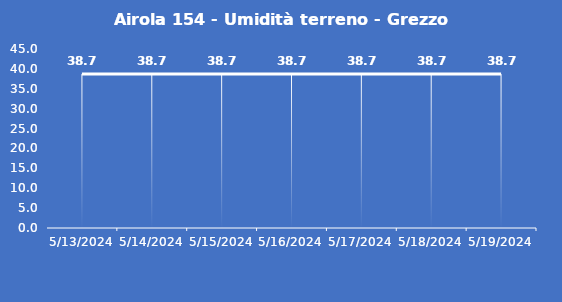
| Category | Airola 154 - Umidità terreno - Grezzo (%VWC) |
|---|---|
| 5/13/24 | 38.7 |
| 5/14/24 | 38.7 |
| 5/15/24 | 38.7 |
| 5/16/24 | 38.7 |
| 5/17/24 | 38.7 |
| 5/18/24 | 38.7 |
| 5/19/24 | 38.7 |